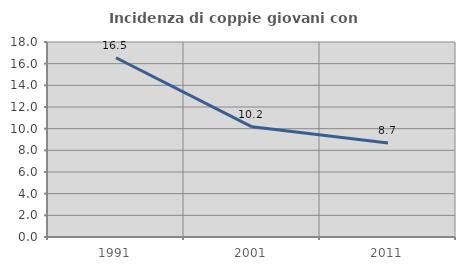
| Category | Incidenza di coppie giovani con figli |
|---|---|
| 1991.0 | 16.549 |
| 2001.0 | 10.173 |
| 2011.0 | 8.687 |